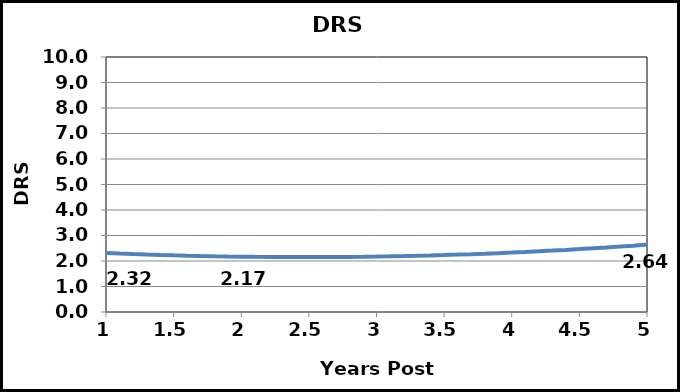
| Category | DRS |
|---|---|
| 1.0 | 2.316 |
| 1.1 | 2.295 |
| 1.2 | 2.275 |
| 1.3 | 2.256 |
| 1.4 | 2.239 |
| 1.5 | 2.224 |
| 1.6 | 2.21 |
| 1.7 | 2.198 |
| 1.8 | 2.187 |
| 1.9 | 2.177 |
| 2.0 | 2.17 |
| 2.1 | 2.163 |
| 2.2 | 2.158 |
| 2.3 | 2.155 |
| 2.4 | 2.153 |
| 2.5 | 2.153 |
| 2.6 | 2.154 |
| 2.7 | 2.157 |
| 2.8 | 2.161 |
| 2.9 | 2.167 |
| 3.0 | 2.175 |
| 3.1 | 2.183 |
| 3.2 | 2.194 |
| 3.3 | 2.206 |
| 3.4 | 2.219 |
| 3.5 | 2.234 |
| 3.6 | 2.25 |
| 3.7 | 2.268 |
| 3.8 | 2.288 |
| 3.9 | 2.309 |
| 4.0 | 2.331 |
| 4.1 | 2.355 |
| 4.2 | 2.38 |
| 4.3 | 2.407 |
| 4.4 | 2.436 |
| 4.5 | 2.466 |
| 4.6 | 2.497 |
| 4.7 | 2.531 |
| 4.8 | 2.565 |
| 4.9 | 2.601 |
| 5.0 | 2.639 |